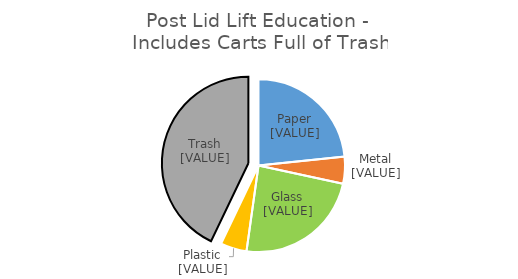
| Category | Series 0 |
|---|---|
| Paper | 0.234 |
| Metals | 0.05 |
| Glass | 0.238 |
| Plastic | 0.049 |
| Trash  | 0.429 |